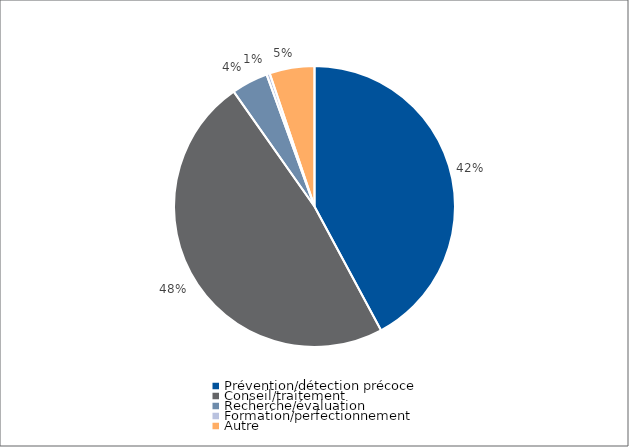
| Category | Series 0 |
|---|---|
| Prévention/détection précoce | 231393 |
| Conseil/traitement | 264000 |
| Recherche/évaluation | 23105 |
| Formation/perfectionnement | 2074 |
| Autre | 28371 |